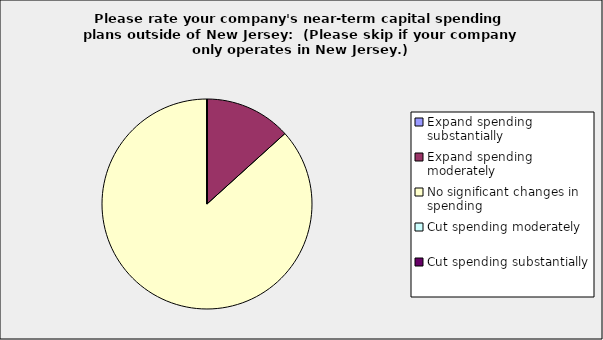
| Category | Series 0 |
|---|---|
| Expand spending substantially | 0 |
| Expand spending moderately | 0.133 |
| No significant changes in spending | 0.867 |
| Cut spending moderately | 0 |
| Cut spending substantially | 0 |